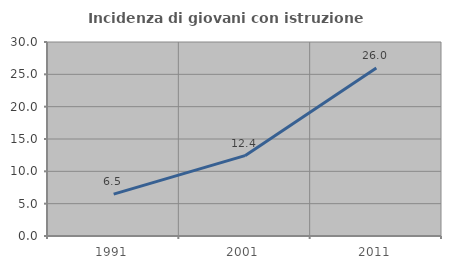
| Category | Incidenza di giovani con istruzione universitaria |
|---|---|
| 1991.0 | 6.476 |
| 2001.0 | 12.426 |
| 2011.0 | 25.964 |